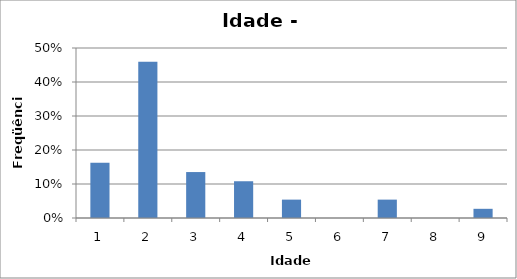
| Category | Series 0 |
|---|---|
| 0 | 0.162 |
| 1 | 0.459 |
| 2 | 0.135 |
| 3 | 0.108 |
| 4 | 0.054 |
| 5 | 0 |
| 6 | 0.054 |
| 7 | 0 |
| 8 | 0.027 |